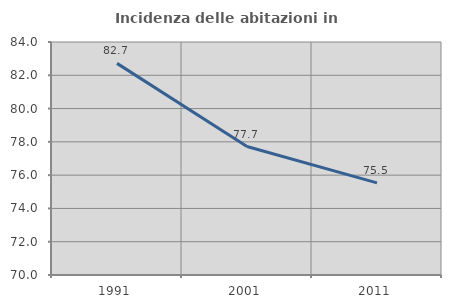
| Category | Incidenza delle abitazioni in proprietà  |
|---|---|
| 1991.0 | 82.715 |
| 2001.0 | 77.72 |
| 2011.0 | 75.532 |